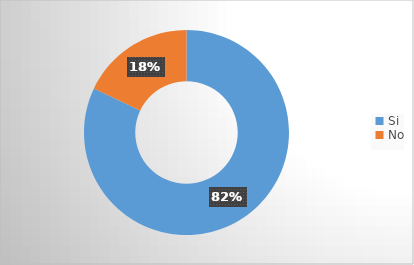
| Category | Series 0 |
|---|---|
| Si | 0.821 |
| No | 0.179 |